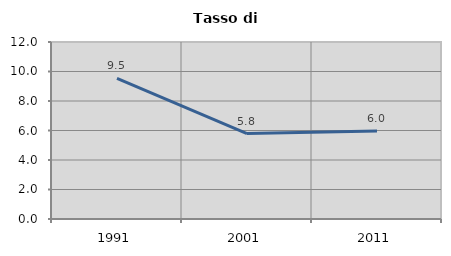
| Category | Tasso di disoccupazione   |
|---|---|
| 1991.0 | 9.542 |
| 2001.0 | 5.794 |
| 2011.0 | 5.959 |